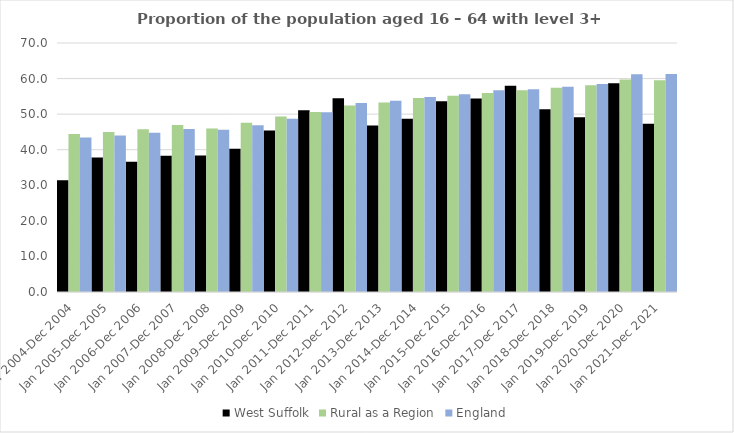
| Category | West Suffolk | Rural as a Region | England |
|---|---|---|---|
| Jan 2004-Dec 2004 | 31.4 | 44.405 | 43.4 |
| Jan 2005-Dec 2005 | 37.8 | 44.973 | 44 |
| Jan 2006-Dec 2006 | 36.6 | 45.774 | 44.8 |
| Jan 2007-Dec 2007 | 38.3 | 46.968 | 45.8 |
| Jan 2008-Dec 2008 | 38.4 | 45.964 | 45.6 |
| Jan 2009-Dec 2009 | 40.3 | 47.59 | 46.9 |
| Jan 2010-Dec 2010 | 45.4 | 49.362 | 48.7 |
| Jan 2011-Dec 2011 | 51.1 | 50.602 | 50.5 |
| Jan 2012-Dec 2012 | 54.5 | 52.439 | 53.1 |
| Jan 2013-Dec 2013 | 46.8 | 53.276 | 53.8 |
| Jan 2014-Dec 2014 | 48.7 | 54.57 | 54.8 |
| Jan 2015-Dec 2015 | 53.6 | 55.16 | 55.6 |
| Jan 2016-Dec 2016 | 54.4 | 55.941 | 56.7 |
| Jan 2017-Dec 2017 | 58 | 56.689 | 57 |
| Jan 2018-Dec 2018 | 51.4 | 57.389 | 57.7 |
| Jan 2019-Dec 2019 | 49.1 | 58.147 | 58.5 |
| Jan 2020-Dec 2020 | 58.7 | 59.771 | 61.2 |
| Jan 2021-Dec 2021 | 47.3 | 59.54 | 61.3 |